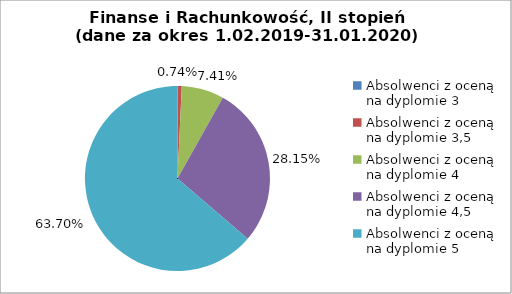
| Category | Series 0 |
|---|---|
| Absolwenci z oceną na dyplomie 3 | 0 |
| Absolwenci z oceną na dyplomie 3,5 | 0.741 |
| Absolwenci z oceną na dyplomie 4 | 7.407 |
| Absolwenci z oceną na dyplomie 4,5 | 28.148 |
| Absolwenci z oceną na dyplomie 5 | 63.704 |